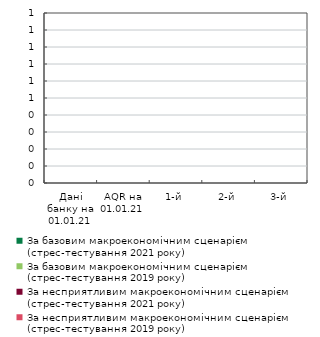
| Category | За базовим макроекономічним сценарієм (стрес-тестування 2021 року) | За базовим макроекономічним сценарієм (стрес-тестування 2019 року) | За несприятливим макроекономічним сценарієм (стрес-тестування 2021 року) | За несприятливим макроекономічним сценарієм (стрес-тестування 2019 року) |
|---|---|---|---|---|
| Дані банку на 01.01.21 | 0 | 0 | 0 | 0 |
| AQR на 01.01.21 | 0 | 0 | 0 | 0 |
| 1-й | 0 | 0 | 0 | 0 |
| 2-й | 0 | 0 | 0 | 0 |
| 3-й | 0 | 0 | 0 | 0 |